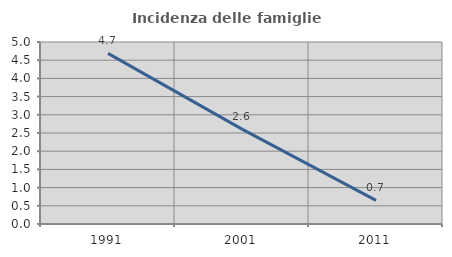
| Category | Incidenza delle famiglie numerose |
|---|---|
| 1991.0 | 4.688 |
| 2001.0 | 2.606 |
| 2011.0 | 0.651 |